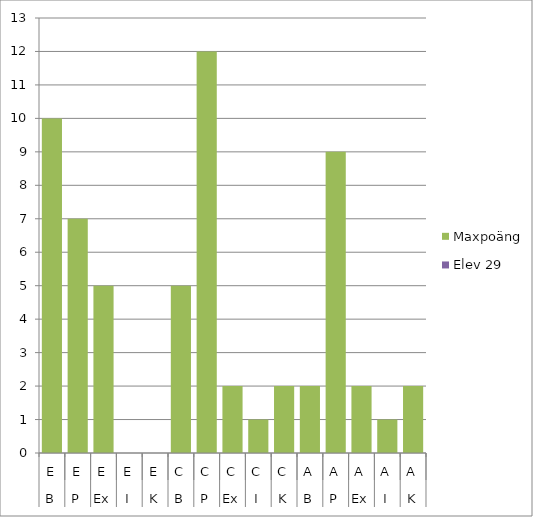
| Category | Maxpoäng | Elev 29 |
|---|---|---|
| 0 | 10 | 0 |
| 1 | 7 | 0 |
| 2 | 5 | 0 |
| 3 | 0 | 0 |
| 4 | 0 | 0 |
| 5 | 5 | 0 |
| 6 | 12 | 0 |
| 7 | 2 | 0 |
| 8 | 1 | 0 |
| 9 | 2 | 0 |
| 10 | 2 | 0 |
| 11 | 9 | 0 |
| 12 | 2 | 0 |
| 13 | 1 | 0 |
| 14 | 2 | 0 |